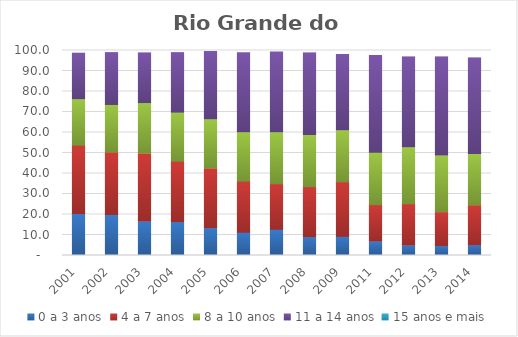
| Category | 0 a 3 anos | 4 a 7 anos | 8 a 10 anos | 11 a 14 anos | 15 anos e mais |
|---|---|---|---|---|---|
| 2001.0 | 20.46 | 33.37 | 22.66 | 22.17 | 0 |
| 2002.0 | 20.02 | 30.55 | 23.11 | 25.29 | 0 |
| 2003.0 | 16.86 | 33.14 | 24.59 | 24.25 | 0 |
| 2004.0 | 16.51 | 29.51 | 23.94 | 29 | 0 |
| 2005.0 | 13.59 | 29.13 | 23.95 | 32.79 | 0 |
| 2006.0 | 11.35 | 24.95 | 24.09 | 38.54 | 0 |
| 2007.0 | 12.8 | 22.27 | 25.29 | 38.92 | 0 |
| 2008.0 | 9.19 | 24.44 | 25.45 | 39.68 | 0 |
| 2009.0 | 9.37 | 26.67 | 25.34 | 36.72 | 0 |
| 2011.0 | 7.1 | 17.75 | 25.46 | 47.22 | 0 |
| 2012.0 | 5.14 | 20.17 | 27.68 | 43.81 | 0 |
| 2013.0 | 4.86 | 16.5 | 27.67 | 47.74 | 0 |
| 2014.0 | 5.22 | 19.51 | 25.04 | 46.54 | 0 |